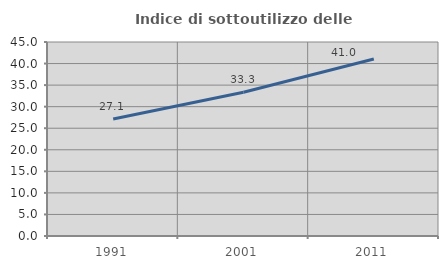
| Category | Indice di sottoutilizzo delle abitazioni  |
|---|---|
| 1991.0 | 27.146 |
| 2001.0 | 33.333 |
| 2011.0 | 41.042 |